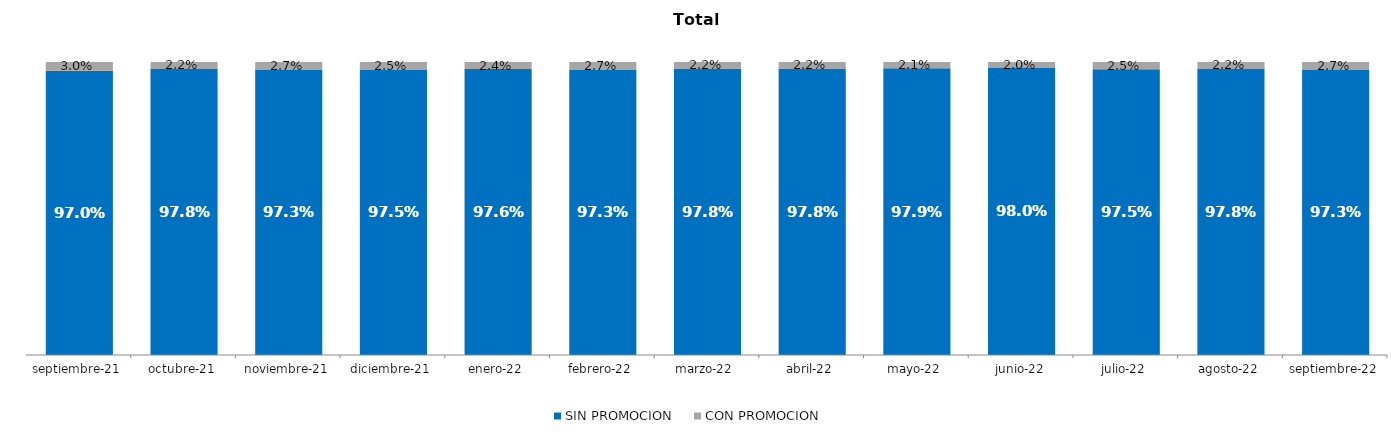
| Category | SIN PROMOCION   | CON PROMOCION   |
|---|---|---|
| 2021-09-01 | 0.97 | 0.03 |
| 2021-10-01 | 0.978 | 0.022 |
| 2021-11-01 | 0.973 | 0.027 |
| 2021-12-01 | 0.975 | 0.025 |
| 2022-01-01 | 0.976 | 0.024 |
| 2022-02-01 | 0.973 | 0.027 |
| 2022-03-01 | 0.978 | 0.022 |
| 2022-04-01 | 0.978 | 0.022 |
| 2022-05-01 | 0.979 | 0.021 |
| 2022-06-01 | 0.98 | 0.02 |
| 2022-07-01 | 0.975 | 0.025 |
| 2022-08-01 | 0.978 | 0.022 |
| 2022-09-01 | 0.973 | 0.027 |